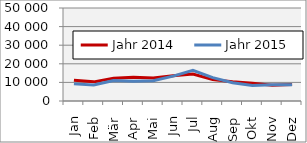
| Category | Jahr 2014 | Jahr 2015 |
|---|---|---|
| Jan | 11207.748 | 9207.39 |
| Feb | 10293.791 | 8641.588 |
| Mär | 12175.379 | 11065.888 |
| Apr | 12711.943 | 10647.104 |
| Mai | 12331.307 | 10898.285 |
| Jun | 13583.105 | 13379.412 |
| Jul | 14506.905 | 16487.788 |
| Aug | 11489.316 | 12558.569 |
| Sep | 10346.002 | 9806.79 |
| Okt | 9565.324 | 8306.045 |
| Nov | 8488.563 | 8707.908 |
| Dez | 8826.654 | 8747.422 |